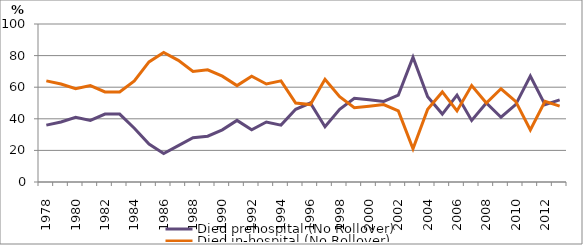
| Category | Died prehospital (No Rollover) | Died in-hospital (No Rollover) |
|---|---|---|
| 1978.0 | 36 | 64 |
| 1979.0 | 38 | 62 |
| 1980.0 | 41 | 59 |
| 1981.0 | 39 | 61 |
| 1982.0 | 43 | 57 |
| 1983.0 | 43 | 57 |
| 1984.0 | 34 | 64 |
| 1985.0 | 24 | 76 |
| 1986.0 | 18 | 82 |
| 1987.0 | 23 | 77 |
| 1988.0 | 28 | 70 |
| 1989.0 | 29 | 71 |
| 1990.0 | 33 | 67 |
| 1991.0 | 39 | 61 |
| 1992.0 | 33 | 67 |
| 1993.0 | 38 | 62 |
| 1994.0 | 36 | 64 |
| 1995.0 | 46 | 50 |
| 1996.0 | 50 | 49 |
| 1997.0 | 35 | 65 |
| 1998.0 | 46 | 54 |
| 1999.0 | 53 | 47 |
| 2000.0 | 52 | 48 |
| 2001.0 | 51 | 49 |
| 2002.0 | 55 | 45 |
| 2003.0 | 79 | 21 |
| 2004.0 | 54 | 46 |
| 2005.0 | 43 | 57 |
| 2006.0 | 55 | 45 |
| 2007.0 | 39 | 61 |
| 2008.0 | 50 | 50 |
| 2009.0 | 41 | 59 |
| 2010.0 | 49 | 51 |
| 2011.0 | 67 | 33 |
| 2012.0 | 49 | 51 |
| 2013.0 | 52 | 48 |